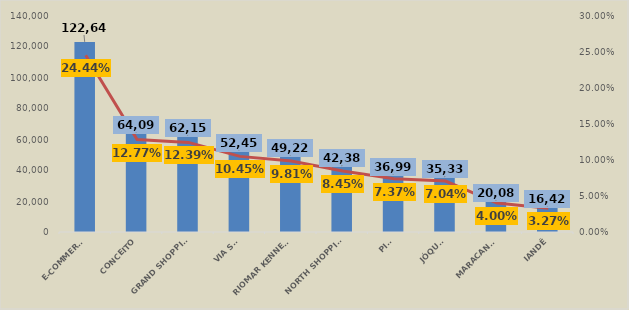
| Category | Em R$ 1 |
|---|---|
| E-COMMERCE | 122646.712 |
| CONCEITO | 64091.304 |
| GRAND SHOPPING | 62154.038 |
| VIA SUL | 52451.994 |
| RIOMAR KENNEDY | 49229.093 |
| NORTH SHOPPING | 42384.596 |
| PICI | 36993.324 |
| JÓQUEI | 35330.849 |
| MARACANAÚ | 20088.266 |
| IANDÊ | 16427.431 |